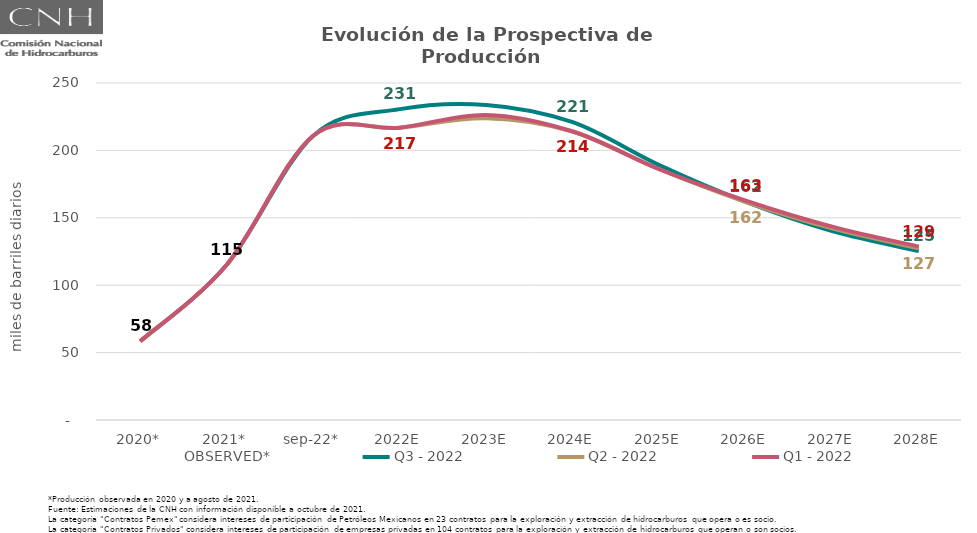
| Category | OBSERVED* | Q3 - 2022 | Q2 - 2022 | Q1 - 2022 |
|---|---|---|---|---|
| 2020* | 58.421 | 58.421 | 58.421 | 58.421 |
| 2021* | 115.166 | 115.166 | 115.166 | 115.166 |
| sep-22* | 210.883 | 210.883 | 210.883 | 210.883 |
| 2022E | 230.623 | 230.623 | 216.81 | 216.81 |
| 2023E | 233.737 | 233.737 | 223.922 | 226.306 |
| 2024E | 220.901 | 220.901 | 214.023 | 214.023 |
| 2025E | 189.089 | 189.089 | 186.027 | 186.027 |
| 2026E | 161.79 | 161.79 | 161.721 | 162.772 |
| 2027E | 140.11 | 140.11 | 142.105 | 143.464 |
| 2028E | 125.321 | 125.321 | 127.344 | 128.656 |